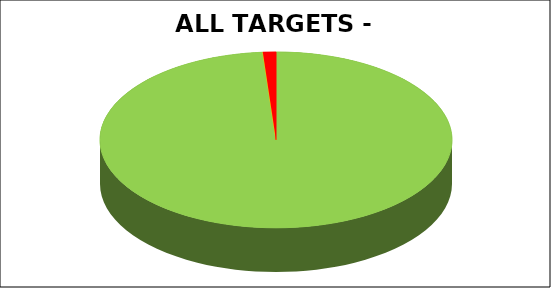
| Category | Series 0 |
|---|---|
| Green | 0.988 |
| Amber | 0 |
| Red | 0.012 |